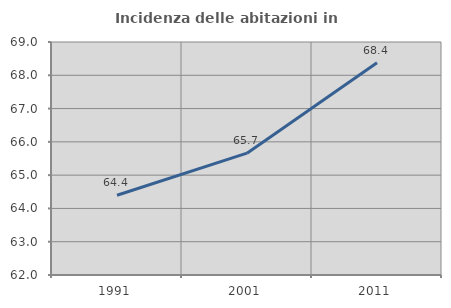
| Category | Incidenza delle abitazioni in proprietà  |
|---|---|
| 1991.0 | 64.396 |
| 2001.0 | 65.659 |
| 2011.0 | 68.375 |